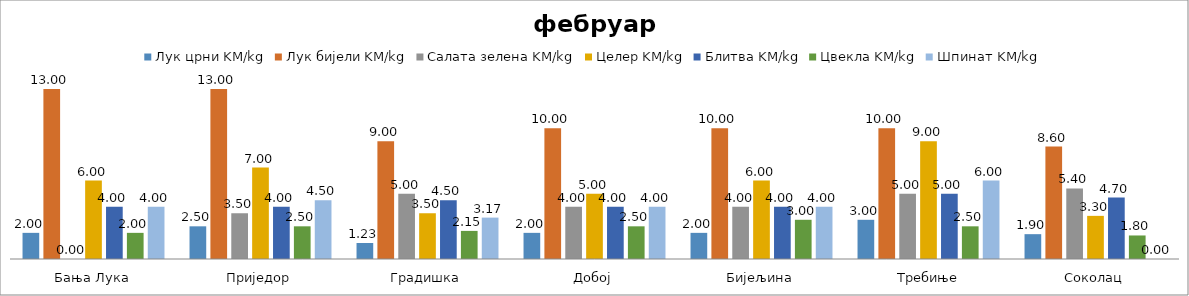
| Category | Лук црни | Лук бијели | Салата зелена | Целер | Блитва | Цвекла | Шпинат |
|---|---|---|---|---|---|---|---|
| Бања Лука | 2 | 13 | 0 | 6 | 4 | 2 | 4 |
| Приједор | 2.5 | 13 | 3.5 | 7 | 4 | 2.5 | 4.5 |
| Градишка | 1.225 | 9 | 5 | 3.5 | 4.5 | 2.15 | 3.167 |
| Добој | 2 | 10 | 4 | 5 | 4 | 2.5 | 4 |
| Бијељина | 2 | 10 | 4 | 6 | 4 | 3 | 4 |
|  Требиње | 3 | 10 | 5 | 9 | 5 | 2.5 | 6 |
| Соколац | 1.9 | 8.6 | 5.4 | 3.3 | 4.7 | 1.8 | 0 |